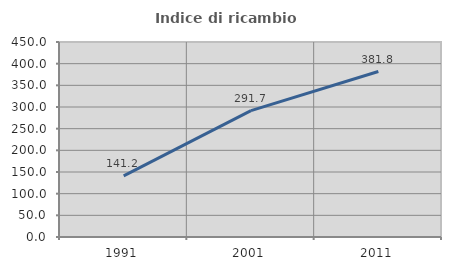
| Category | Indice di ricambio occupazionale  |
|---|---|
| 1991.0 | 141.176 |
| 2001.0 | 291.667 |
| 2011.0 | 381.818 |